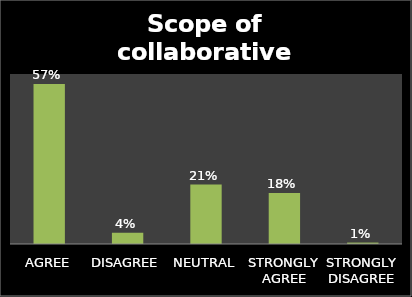
| Category | Series 0 |
|---|---|
| AGREE | 0.565 |
| DISAGREE | 0.04 |
| NEUTRAL | 0.21 |
| STRONGLY AGREE | 0.18 |
| STRONGLY DISAGREE | 0.005 |